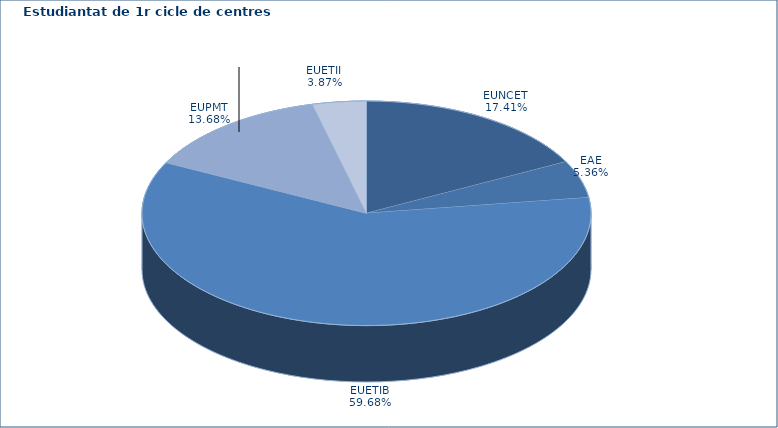
| Category | Series 0 |
|---|---|
| EUNCET | 364 |
| EAE | 112 |
| EUETIB | 1248 |
| EUPMT | 286 |
| EUETII | 81 |